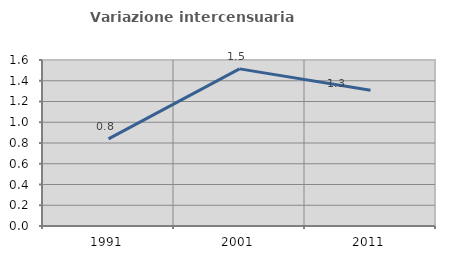
| Category | Variazione intercensuaria annua |
|---|---|
| 1991.0 | 0.839 |
| 2001.0 | 1.514 |
| 2011.0 | 1.308 |